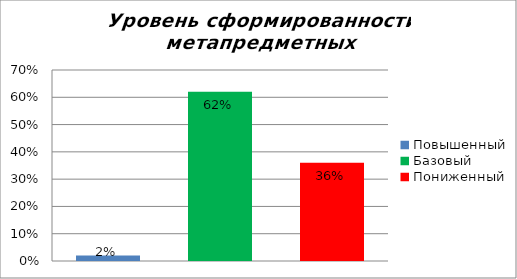
| Category | Уровень сформированности метапредметных результатов |
|---|---|
| Повышенный | 0.02 |
| Базовый | 0.62 |
| Пониженный | 0.36 |